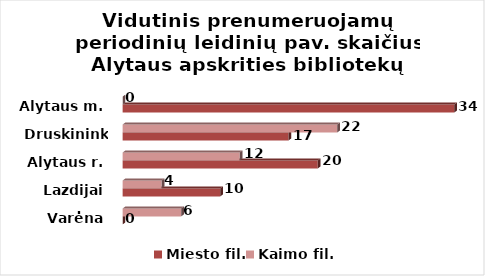
| Category | Miesto fil. | Kaimo fil. |
|---|---|---|
| Varėna | 0 | 6 |
| Lazdijai | 10 | 4 |
| Alytaus r. | 20 | 12 |
| Druskininkai | 17 | 22 |
| Alytaus m. | 34 | 0 |